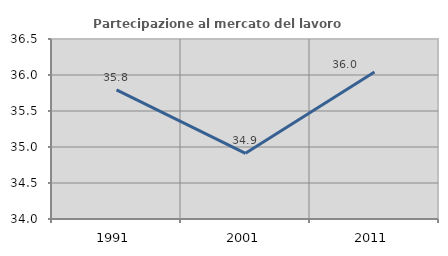
| Category | Partecipazione al mercato del lavoro  femminile |
|---|---|
| 1991.0 | 35.793 |
| 2001.0 | 34.912 |
| 2011.0 | 36.043 |